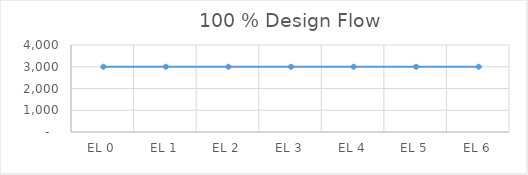
| Category |          100 % Design Flow |
|---|---|
| EL 0 | 3000 |
| EL 1 | 3000 |
| EL 2 | 3000 |
| EL 3 | 3000 |
| EL 4 | 3000 |
| EL 5 | 3000 |
| EL 6 | 3000 |